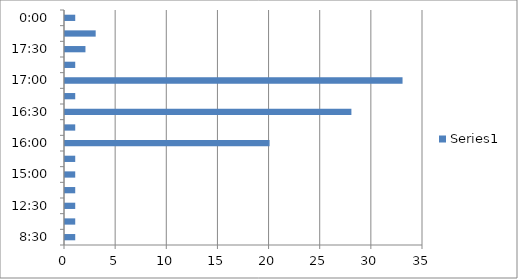
| Category | Series 0 |
|---|---|
| 0.3541666666666667 | 1 |
| 0.5 | 1 |
| 0.5208333333333334 | 1 |
| 0.5416666666666666 | 1 |
| 0.625 | 1 |
| 0.6458333333333334 | 1 |
| 0.6666666666666666 | 20 |
| 0.6770833333333334 | 1 |
| 0.6875 | 28 |
| 0.6979166666666666 | 1 |
| 0.7083333333333334 | 33 |
| 0.71875 | 1 |
| 0.7291666666666666 | 2 |
| 0.75 | 3 |
| 1900-01-01 | 1 |